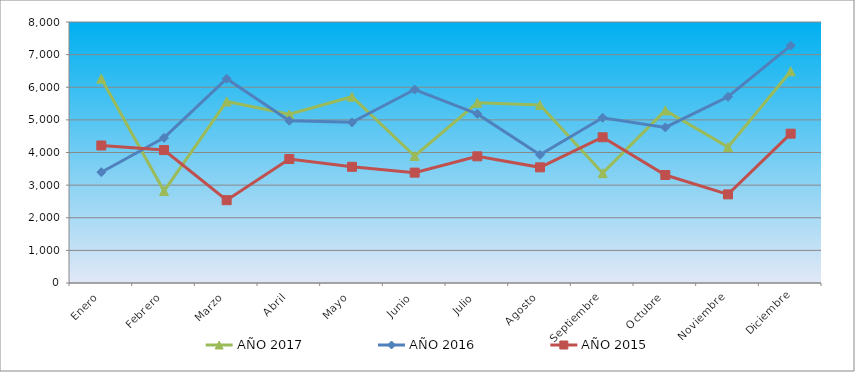
| Category | AÑO 2017 | AÑO 2016 | AÑO 2015 |
|---|---|---|---|
| Enero | 6264 | 3396 | 4215 |
| Febrero | 2818 | 4448 | 4074 |
| Marzo | 5564 | 6261 | 2539 |
| Abril | 5171 | 4975 | 3801 |
| Mayo | 5710 | 4924 | 3562 |
| Junio | 3893 | 5930 | 3383 |
| Julio | 5525 | 5184 | 3883 |
| Agosto | 5456 | 3928 | 3545 |
| Septiembre | 3366 | 5065 | 4467 |
| Octubre | 5290 | 4769 | 3310 |
| Noviembre | 4166 | 5708 | 2716 |
| Diciembre | 6489 | 7277 | 4577 |